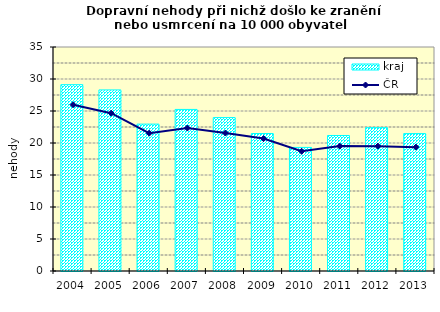
| Category | kraj |
|---|---|
| 2004.0 | 29.114 |
| 2005.0 | 28.294 |
| 2006.0 | 22.95 |
| 2007.0 | 25.246 |
| 2008.0 | 23.97 |
| 2009.0 | 21.481 |
| 2010.0 | 19.308 |
| 2011.0 | 21.173 |
| 2012.0 | 22.399 |
| 2013.0 | 21.468 |